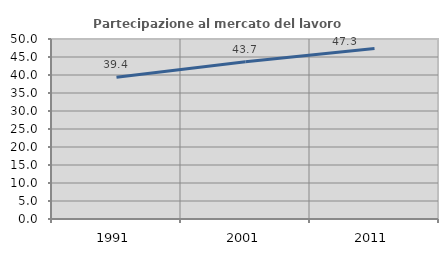
| Category | Partecipazione al mercato del lavoro  femminile |
|---|---|
| 1991.0 | 39.388 |
| 2001.0 | 43.668 |
| 2011.0 | 47.347 |